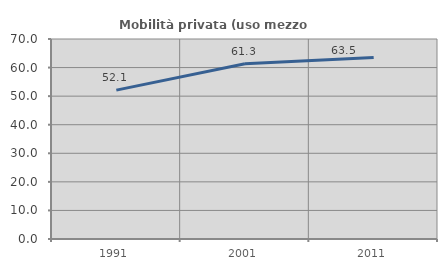
| Category | Mobilità privata (uso mezzo privato) |
|---|---|
| 1991.0 | 52.116 |
| 2001.0 | 61.341 |
| 2011.0 | 63.538 |